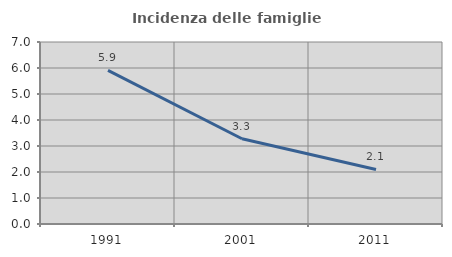
| Category | Incidenza delle famiglie numerose |
|---|---|
| 1991.0 | 5.909 |
| 2001.0 | 3.278 |
| 2011.0 | 2.099 |